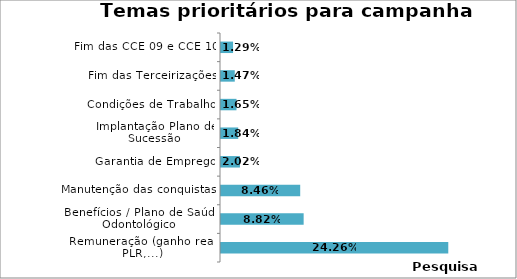
| Category | Series 0 |
|---|---|
| Remuneração (ganho real, PLR,...) | 0.243 |
| Benefícios / Plano de Saúde Odontológico | 0.088 |
| Manutenção das conquistas | 0.085 |
| Garantia de Emprego | 0.02 |
| Implantação Plano de Sucessão | 0.018 |
| Condições de Trabalho | 0.017 |
| Fim das Terceirizações | 0.015 |
| Fim das CCE 09 e CCE 10 | 0.013 |